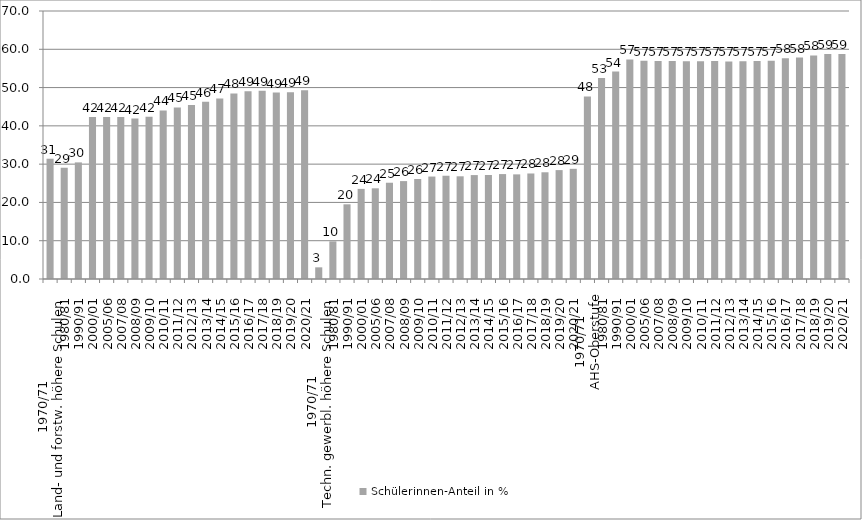
| Category | Schülerinnen-Anteil in % |
|---|---|
| 0 | 31.413 |
| 1 | 29.058 |
| 2 | 30.459 |
| 3 | 42.319 |
| 4 | 42.299 |
| 5 | 42.312 |
| 6 | 41.894 |
| 7 | 42.35 |
| 8 | 44.017 |
| 9 | 44.826 |
| 10 | 45.455 |
| 11 | 46.302 |
| 12 | 47.176 |
| 13 | 48.464 |
| 14 | 49.048 |
| 15 | 49.156 |
| 16 | 48.69 |
| 17 | 48.782 |
| 18 | 49.271 |
| 19 | 3.047 |
| 20 | 9.836 |
| 21 | 19.507 |
| 22 | 23.539 |
| 23 | 23.689 |
| 24 | 25.144 |
| 25 | 25.572 |
| 26 | 26.125 |
| 27 | 26.762 |
| 28 | 26.969 |
| 29 | 26.824 |
| 30 | 27.144 |
| 31 | 27.161 |
| 32 | 27.407 |
| 33 | 27.33 |
| 34 | 27.562 |
| 35 | 27.876 |
| 36 | 28.443 |
| 37 | 28.778 |
| 38 | 47.684 |
| 39 | 52.531 |
| 40 | 54.165 |
| 41 | 57.353 |
| 42 | 57.029 |
| 43 | 56.953 |
| 44 | 56.951 |
| 45 | 56.857 |
| 46 | 56.851 |
| 47 | 56.959 |
| 48 | 56.823 |
| 49 | 56.871 |
| 50 | 56.955 |
| 51 | 57.008 |
| 52 | 57.648 |
| 53 | 57.851 |
| 54 | 58.381 |
| 55 | 58.744 |
| 56 | 58.762 |